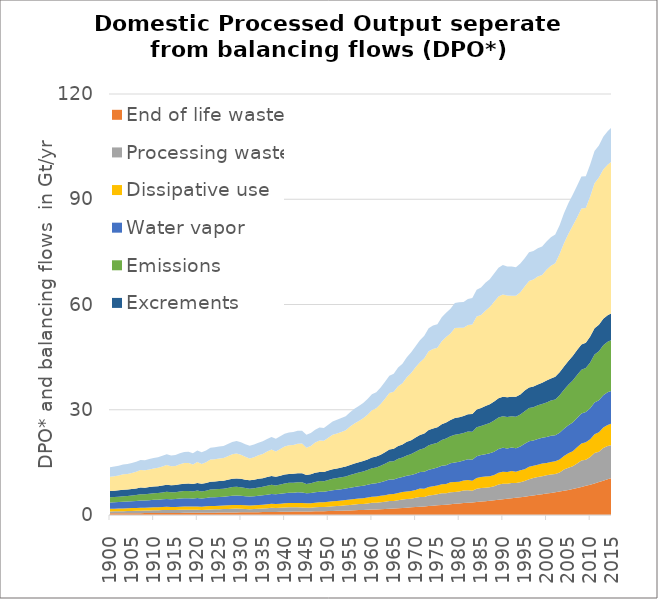
| Category | End of life waste | Processing waste | Dissipative use | Water vapor | Emissions | Excrements | Balancing O2 | Balancing H2O |
|---|---|---|---|---|---|---|---|---|
| 1900.0 | 0.487 | 0.537 | 0.756 | 1.805 | 1.477 | 1.766 | 4.073 | 2.728 |
| 1901.0 | 0.491 | 0.556 | 0.765 | 1.829 | 1.503 | 1.782 | 4.149 | 2.751 |
| 1902.0 | 0.495 | 0.573 | 0.777 | 1.851 | 1.526 | 1.798 | 4.211 | 2.773 |
| 1903.0 | 0.502 | 0.6 | 0.785 | 1.902 | 1.588 | 1.814 | 4.396 | 2.796 |
| 1904.0 | 0.507 | 0.616 | 0.792 | 1.92 | 1.606 | 1.83 | 4.445 | 2.818 |
| 1905.0 | 0.515 | 0.649 | 0.801 | 1.957 | 1.65 | 1.846 | 4.575 | 2.84 |
| 1906.0 | 0.521 | 0.67 | 0.809 | 2.006 | 1.709 | 1.862 | 4.752 | 2.863 |
| 1907.0 | 0.533 | 0.712 | 0.82 | 2.067 | 1.793 | 1.878 | 5.007 | 2.885 |
| 1908.0 | 0.535 | 0.714 | 0.83 | 2.059 | 1.77 | 1.894 | 4.926 | 2.908 |
| 1909.0 | 0.545 | 0.745 | 0.839 | 2.095 | 1.812 | 1.91 | 5.053 | 2.93 |
| 1910.0 | 0.555 | 0.777 | 0.848 | 2.133 | 1.858 | 1.926 | 5.19 | 2.952 |
| 1911.0 | 0.564 | 0.791 | 0.857 | 2.162 | 1.889 | 1.949 | 5.279 | 2.984 |
| 1912.0 | 0.572 | 0.828 | 0.866 | 2.21 | 1.945 | 1.972 | 5.445 | 3.016 |
| 1913.0 | 0.582 | 0.867 | 0.876 | 2.27 | 2.021 | 1.995 | 5.671 | 3.048 |
| 1914.0 | 0.588 | 0.82 | 0.881 | 2.226 | 1.944 | 2.018 | 5.436 | 3.08 |
| 1915.0 | 0.597 | 0.831 | 0.887 | 2.237 | 1.948 | 2.04 | 5.451 | 3.112 |
| 1916.0 | 0.604 | 0.881 | 0.898 | 2.298 | 2.02 | 2.063 | 5.683 | 3.144 |
| 1917.0 | 0.611 | 0.903 | 0.908 | 2.345 | 2.081 | 2.086 | 5.874 | 3.176 |
| 1918.0 | 0.616 | 0.897 | 0.916 | 2.355 | 2.078 | 2.109 | 5.863 | 3.208 |
| 1919.0 | 0.621 | 0.844 | 0.926 | 2.299 | 1.987 | 2.132 | 5.586 | 3.24 |
| 1920.0 | 0.625 | 0.888 | 0.938 | 2.394 | 2.127 | 2.155 | 6.014 | 3.272 |
| 1921.0 | 0.632 | 0.81 | 0.942 | 2.325 | 2.014 | 2.18 | 5.655 | 3.302 |
| 1922.0 | 0.644 | 0.869 | 0.957 | 2.376 | 2.091 | 2.206 | 5.879 | 3.333 |
| 1923.0 | 0.655 | 0.936 | 0.967 | 2.47 | 2.224 | 2.231 | 6.304 | 3.363 |
| 1924.0 | 0.663 | 0.95 | 0.986 | 2.483 | 2.234 | 2.256 | 6.32 | 3.394 |
| 1925.0 | 0.678 | 0.984 | 0.997 | 2.506 | 2.261 | 2.281 | 6.384 | 3.425 |
| 1926.0 | 0.689 | 0.992 | 1.008 | 2.525 | 2.278 | 2.307 | 6.429 | 3.455 |
| 1927.0 | 0.703 | 1.024 | 1.018 | 2.582 | 2.364 | 2.332 | 6.695 | 3.486 |
| 1928.0 | 0.72 | 1.07 | 1.027 | 2.66 | 2.468 | 2.357 | 7.013 | 3.516 |
| 1929.0 | 0.736 | 1.103 | 1.036 | 2.674 | 2.488 | 2.382 | 7.091 | 3.547 |
| 1930.0 | 0.748 | 1.055 | 1.045 | 2.637 | 2.412 | 2.408 | 6.853 | 3.577 |
| 1931.0 | 0.762 | 0.971 | 1.047 | 2.577 | 2.305 | 2.42 | 6.522 | 3.583 |
| 1932.0 | 0.773 | 0.88 | 1.061 | 2.527 | 2.213 | 2.431 | 6.248 | 3.589 |
| 1933.0 | 0.786 | 0.906 | 1.08 | 2.565 | 2.267 | 2.443 | 6.421 | 3.595 |
| 1934.0 | 0.805 | 0.972 | 1.095 | 2.628 | 2.361 | 2.454 | 6.706 | 3.601 |
| 1935.0 | 0.821 | 1.016 | 1.111 | 2.668 | 2.426 | 2.466 | 6.904 | 3.607 |
| 1936.0 | 0.841 | 1.082 | 1.131 | 2.74 | 2.532 | 2.477 | 7.261 | 3.612 |
| 1937.0 | 0.862 | 1.174 | 1.141 | 2.793 | 2.63 | 2.489 | 7.556 | 3.618 |
| 1938.0 | 0.877 | 1.109 | 1.144 | 2.756 | 2.521 | 2.5 | 7.169 | 3.624 |
| 1939.0 | 0.899 | 1.154 | 1.17 | 2.818 | 2.659 | 2.512 | 7.629 | 3.63 |
| 1940.0 | 0.921 | 1.216 | 1.189 | 2.907 | 2.775 | 2.523 | 8.012 | 3.636 |
| 1941.0 | 0.94 | 1.243 | 1.208 | 2.941 | 2.831 | 2.535 | 8.184 | 3.642 |
| 1942.0 | 0.963 | 1.214 | 1.221 | 2.965 | 2.844 | 2.546 | 8.233 | 3.648 |
| 1943.0 | 0.982 | 1.231 | 1.238 | 2.999 | 2.893 | 2.558 | 8.426 | 3.654 |
| 1944.0 | 1 | 1.165 | 1.254 | 2.994 | 2.897 | 2.57 | 8.497 | 3.659 |
| 1945.0 | 1.011 | 1.062 | 1.263 | 2.832 | 2.661 | 2.581 | 7.788 | 3.665 |
| 1946.0 | 1.027 | 1.059 | 1.285 | 2.888 | 2.762 | 2.593 | 8.075 | 3.671 |
| 1947.0 | 1.051 | 1.142 | 1.307 | 2.99 | 2.932 | 2.604 | 8.616 | 3.677 |
| 1948.0 | 1.074 | 1.196 | 1.337 | 3.035 | 3.032 | 2.616 | 8.95 | 3.682 |
| 1949.0 | 1.098 | 1.189 | 1.347 | 3.016 | 3.004 | 2.628 | 8.854 | 3.688 |
| 1950.0 | 1.126 | 1.255 | 1.368 | 3.103 | 3.158 | 2.639 | 9.354 | 3.694 |
| 1951.0 | 1.161 | 1.33 | 1.407 | 3.172 | 3.292 | 2.681 | 9.808 | 3.777 |
| 1952.0 | 1.194 | 1.376 | 1.436 | 3.198 | 3.344 | 2.725 | 9.984 | 3.859 |
| 1953.0 | 1.227 | 1.442 | 1.47 | 3.22 | 3.398 | 2.769 | 10.156 | 3.942 |
| 1954.0 | 1.27 | 1.51 | 1.503 | 3.245 | 3.454 | 2.814 | 10.335 | 4.026 |
| 1955.0 | 1.302 | 1.568 | 1.547 | 3.344 | 3.644 | 2.859 | 10.934 | 4.111 |
| 1956.0 | 1.348 | 1.648 | 1.583 | 3.421 | 3.789 | 2.904 | 11.407 | 4.197 |
| 1957.0 | 1.394 | 1.711 | 1.617 | 3.485 | 3.895 | 2.95 | 11.764 | 4.283 |
| 1958.0 | 1.436 | 1.696 | 1.65 | 3.556 | 4.029 | 2.997 | 12.217 | 4.371 |
| 1959.0 | 1.489 | 1.784 | 1.699 | 3.633 | 4.194 | 3.044 | 12.764 | 4.459 |
| 1960.0 | 1.543 | 1.918 | 1.727 | 3.744 | 4.4 | 3.091 | 13.452 | 4.548 |
| 1961.0 | 1.593 | 1.934 | 1.757 | 3.764 | 4.469 | 3.164 | 13.712 | 4.602 |
| 1962.0 | 1.649 | 2.006 | 1.802 | 3.876 | 4.676 | 3.199 | 14.417 | 4.738 |
| 1963.0 | 1.713 | 2.03 | 1.902 | 4.015 | 4.934 | 3.267 | 15.295 | 4.801 |
| 1964.0 | 1.775 | 2.204 | 1.952 | 4.155 | 5.175 | 3.404 | 16.087 | 4.967 |
| 1965.0 | 1.851 | 2.144 | 1.971 | 4.152 | 5.205 | 3.561 | 16.249 | 5.138 |
| 1966.0 | 1.926 | 2.298 | 2.062 | 4.285 | 5.431 | 3.655 | 17.016 | 5.382 |
| 1967.0 | 1.994 | 2.401 | 2.131 | 4.321 | 5.532 | 3.75 | 17.425 | 5.556 |
| 1968.0 | 2.079 | 2.482 | 2.159 | 4.461 | 5.81 | 3.854 | 18.384 | 5.745 |
| 1969.0 | 2.177 | 2.484 | 2.171 | 4.538 | 6.009 | 3.947 | 19.148 | 5.897 |
| 1970.0 | 2.267 | 2.641 | 2.23 | 4.639 | 6.245 | 4.09 | 19.982 | 5.993 |
| 1971.0 | 2.351 | 2.797 | 2.38 | 4.719 | 6.457 | 4.095 | 20.749 | 6.268 |
| 1972.0 | 2.44 | 2.697 | 2.344 | 4.839 | 6.69 | 4.21 | 21.473 | 6.404 |
| 1973.0 | 2.547 | 2.979 | 2.459 | 4.943 | 6.975 | 4.315 | 22.459 | 6.526 |
| 1974.0 | 2.649 | 3.063 | 2.479 | 5.022 | 7.043 | 4.406 | 22.685 | 6.697 |
| 1975.0 | 2.751 | 3.154 | 2.507 | 5.106 | 7.054 | 4.437 | 22.651 | 6.718 |
| 1976.0 | 2.84 | 3.325 | 2.608 | 5.255 | 7.341 | 4.488 | 23.654 | 6.867 |
| 1977.0 | 2.94 | 3.282 | 2.634 | 5.347 | 7.568 | 4.597 | 24.361 | 6.911 |
| 1978.0 | 3.053 | 3.433 | 2.817 | 5.443 | 7.681 | 4.647 | 24.68 | 6.999 |
| 1979.0 | 3.177 | 3.411 | 2.787 | 5.575 | 7.953 | 4.744 | 25.664 | 7.108 |
| 1980.0 | 3.282 | 3.418 | 2.792 | 5.655 | 7.93 | 4.753 | 25.542 | 7.239 |
| 1981.0 | 3.387 | 3.563 | 2.887 | 5.693 | 7.841 | 4.816 | 25.197 | 7.346 |
| 1982.0 | 3.493 | 3.578 | 2.896 | 5.91 | 7.944 | 4.931 | 25.437 | 7.404 |
| 1983.0 | 3.59 | 3.323 | 2.845 | 5.996 | 7.991 | 5.061 | 25.509 | 7.515 |
| 1984.0 | 3.709 | 3.753 | 3.065 | 6.211 | 8.254 | 5.081 | 26.48 | 7.651 |
| 1985.0 | 3.828 | 3.84 | 3.172 | 6.275 | 8.262 | 5.108 | 26.5 | 7.857 |
| 1986.0 | 3.945 | 3.856 | 3.155 | 6.382 | 8.477 | 5.228 | 27.184 | 7.948 |
| 1987.0 | 4.071 | 3.856 | 3.13 | 6.511 | 8.628 | 5.388 | 27.696 | 7.943 |
| 1988.0 | 4.208 | 3.985 | 3.178 | 6.675 | 8.855 | 5.457 | 28.457 | 7.996 |
| 1989.0 | 4.353 | 4.307 | 3.359 | 6.781 | 8.958 | 5.503 | 29.003 | 8.209 |
| 1990.0 | 4.492 | 4.447 | 3.392 | 6.838 | 8.987 | 5.553 | 29.164 | 8.379 |
| 1991.0 | 4.619 | 4.291 | 3.349 | 6.689 | 8.995 | 5.602 | 28.996 | 8.325 |
| 1992.0 | 4.745 | 4.373 | 3.437 | 6.673 | 8.886 | 5.603 | 28.787 | 8.302 |
| 1993.0 | 4.883 | 4.207 | 3.258 | 6.702 | 8.957 | 5.69 | 28.814 | 8.112 |
| 1994.0 | 5.041 | 4.328 | 3.352 | 6.795 | 9.096 | 5.704 | 29.141 | 8.242 |
| 1995.0 | 5.234 | 4.476 | 3.366 | 7.227 | 9.281 | 5.868 | 29.653 | 8.11 |
| 1996.0 | 5.405 | 4.813 | 3.526 | 7.263 | 9.464 | 5.903 | 30.309 | 8.223 |
| 1997.0 | 5.586 | 4.984 | 3.451 | 7.189 | 9.537 | 5.883 | 30.487 | 8.125 |
| 1998.0 | 5.767 | 5.088 | 3.464 | 7.339 | 9.593 | 5.94 | 30.787 | 8.058 |
| 1999.0 | 5.941 | 5.126 | 3.6 | 7.351 | 9.586 | 6.097 | 30.713 | 8.092 |
| 2000.0 | 6.122 | 5.231 | 3.44 | 7.439 | 9.834 | 6.273 | 31.55 | 8.087 |
| 2001.0 | 6.302 | 5.221 | 3.572 | 7.462 | 10.048 | 6.315 | 32.114 | 8.16 |
| 2002.0 | 6.505 | 5.151 | 3.661 | 7.414 | 10.161 | 6.531 | 32.341 | 8.164 |
| 2003.0 | 6.704 | 5.391 | 3.737 | 7.647 | 10.629 | 6.568 | 33.696 | 8.238 |
| 2004.0 | 6.932 | 6.037 | 3.833 | 7.78 | 11.129 | 6.621 | 35.107 | 8.559 |
| 2005.0 | 7.157 | 6.298 | 4.149 | 7.991 | 11.533 | 6.752 | 36.204 | 8.754 |
| 2006.0 | 7.417 | 6.485 | 4.274 | 8.204 | 11.956 | 6.959 | 37.168 | 8.825 |
| 2007.0 | 7.723 | 6.982 | 4.602 | 8.374 | 12.24 | 7.116 | 37.79 | 8.995 |
| 2008.0 | 8.008 | 7.499 | 4.873 | 8.524 | 12.517 | 7.161 | 38.77 | 9.143 |
| 2009.0 | 8.312 | 7.465 | 4.995 | 8.554 | 12.562 | 7.235 | 38.38 | 9.081 |
| 2010.0 | 8.62 | 7.895 | 5.103 | 8.793 | 13.089 | 7.368 | 39.923 | 9.131 |
| 2011.0 | 9.007 | 8.697 | 5.343 | 8.987 | 13.704 | 7.488 | 41.326 | 9.178 |
| 2012.0 | 9.377 | 8.636 | 5.553 | 9.16 | 13.965 | 7.552 | 41.96 | 9.138 |
| 2013.0 | 9.763 | 9.333 | 5.821 | 9.24 | 14.251 | 7.519 | 42.534 | 9.379 |
| 2014.0 | 10.161 | 9.494 | 6.016 | 9.303 | 14.397 | 7.584 | 42.846 | 9.585 |
| 2015.0 | 10.524 | 9.447 | 6.124 | 9.319 | 14.529 | 7.677 | 43.217 | 9.714 |